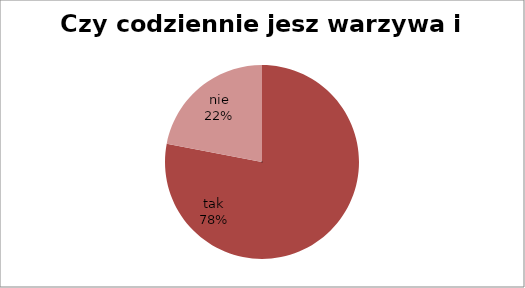
| Category | Czy codziennie jesz warzywa i owoce? |
|---|---|
| tak | 78 |
| nie | 22 |